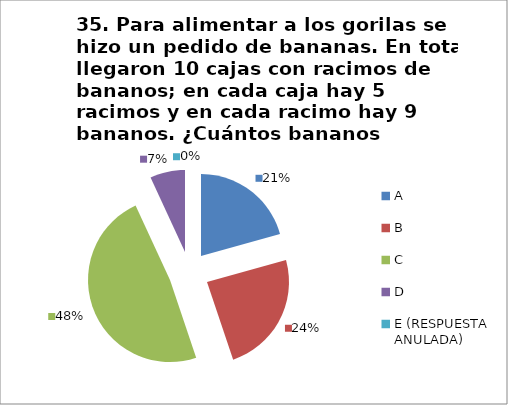
| Category | CANTIDAD DE RESPUESTAS PREGUNTA (35) | PORCENTAJE |
|---|---|---|
| A | 6 | 0.207 |
| B | 7 | 0.241 |
| C | 14 | 0.483 |
| D | 2 | 0.069 |
| E (RESPUESTA ANULADA) | 0 | 0 |